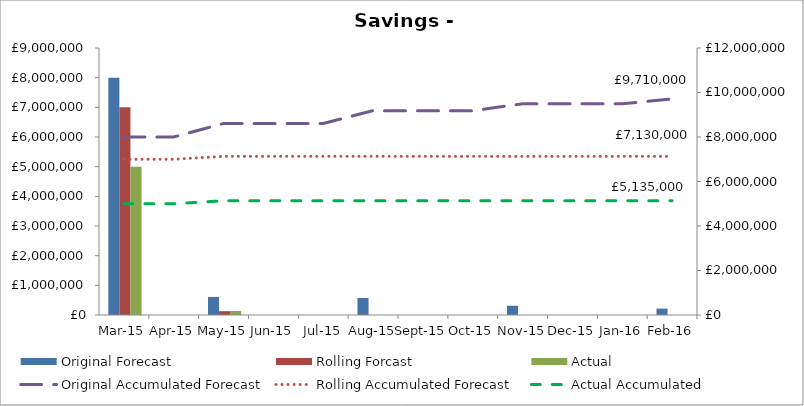
| Category | Original Forecast | Rolling Forcast | Actual |
|---|---|---|---|
| 2015-03-01 | 8000000 | 7000000 | 5000000 |
| 2015-04-01 | 0 | 0 | 0 |
| 2015-05-01 | 609166.66 | 130000 | 135000 |
| 2015-06-01 | 0 | 0 | 0 |
| 2015-07-01 | 0 | 0 | 0 |
| 2015-08-01 | 574166.66 | 0 | 0 |
| 2015-09-01 | 0 | 0 | 0 |
| 2015-10-01 | 0 | 0 | 0 |
| 2015-11-01 | 311666.66 | 0 | 0 |
| 2015-12-01 | 0 | 0 | 0 |
| 2016-01-01 | 0 | 0 | 0 |
| 2016-02-01 | 215000 | 0 | 0 |